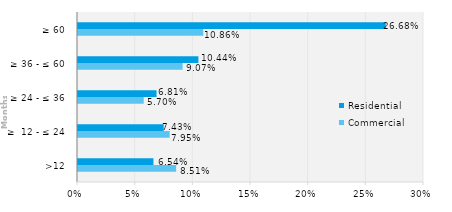
| Category | Commercial | Residential |
|---|---|---|
| >12 | 0.085 | 0.065 |
| ≥  12 - ≤ 24 | 0.08 | 0.074 |
| ≥ 24 - ≤ 36 | 0.057 | 0.068 |
| ≥ 36 - ≤ 60 | 0.091 | 0.104 |
| ≥ 60 | 0.109 | 0.267 |